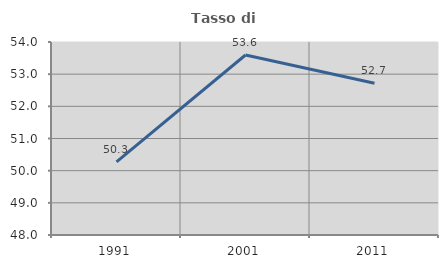
| Category | Tasso di occupazione   |
|---|---|
| 1991.0 | 50.275 |
| 2001.0 | 53.596 |
| 2011.0 | 52.716 |